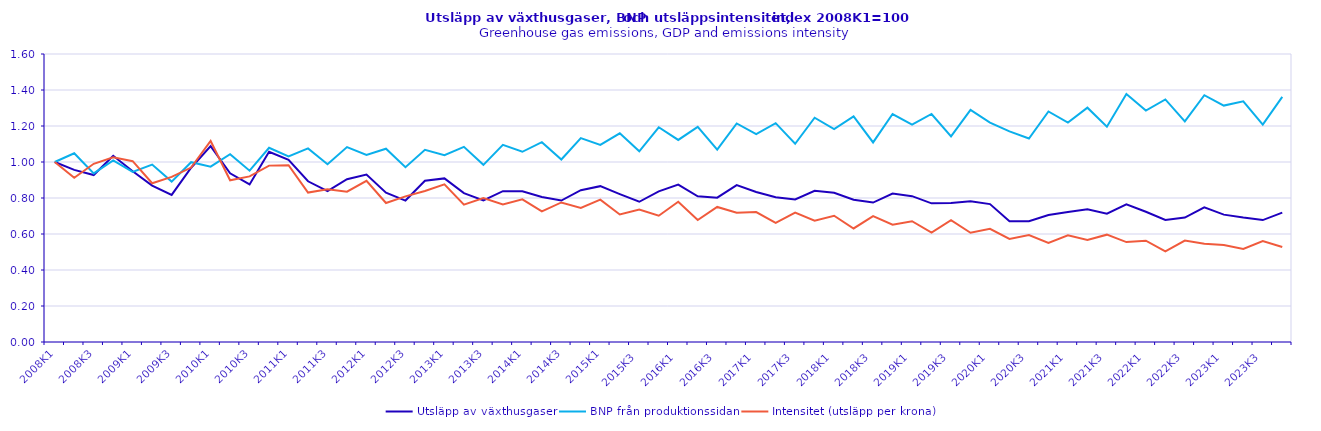
| Category | Utsläpp av växthusgaser | BNP från produktionssidan | Intensitet (utsläpp per krona) |
|---|---|---|---|
|  2008K1 | 1 | 1 | 1 |
|  2008K2 | 0.956 | 1.049 | 0.912 |
|  2008K3 | 0.927 | 0.937 | 0.99 |
|  2008K4 | 1.035 | 1.008 | 1.026 |
|  2009K1 | 0.949 | 0.945 | 1.004 |
|  2009K2 | 0.869 | 0.985 | 0.882 |
|  2009K3 | 0.817 | 0.891 | 0.917 |
|  2009K4 | 0.968 | 0.999 | 0.969 |
|  2010K1 | 1.088 | 0.974 | 1.117 |
|  2010K2 | 0.937 | 1.043 | 0.899 |
|  2010K3 | 0.875 | 0.952 | 0.92 |
|  2010K4 | 1.057 | 1.079 | 0.98 |
|  2011K1 | 1.013 | 1.031 | 0.982 |
|  2011K2 | 0.893 | 1.076 | 0.83 |
|  2011K3 | 0.838 | 0.988 | 0.849 |
|  2011K4 | 0.904 | 1.083 | 0.835 |
|  2012K1 | 0.931 | 1.039 | 0.896 |
|  2012K2 | 0.829 | 1.074 | 0.772 |
|  2012K3 | 0.786 | 0.971 | 0.809 |
|  2012K4 | 0.896 | 1.068 | 0.839 |
|  2013K1 | 0.909 | 1.038 | 0.876 |
|  2013K2 | 0.827 | 1.084 | 0.763 |
|  2013K3 | 0.787 | 0.984 | 0.799 |
|  2013K4 | 0.838 | 1.096 | 0.765 |
|  2014K1 | 0.838 | 1.057 | 0.793 |
|  2014K2 | 0.806 | 1.11 | 0.726 |
|  2014K3 | 0.786 | 1.014 | 0.775 |
|  2014K4 | 0.844 | 1.133 | 0.745 |
|  2015K1 | 0.866 | 1.095 | 0.791 |
|  2015K2 | 0.821 | 1.16 | 0.708 |
| 2015K3 | 0.779 | 1.06 | 0.735 |
| 2015K4 | 0.837 | 1.193 | 0.702 |
| 2016K1 | 0.874 | 1.123 | 0.779 |
| 2016K2 | 0.81 | 1.195 | 0.678 |
| 2016K3 | 0.802 | 1.069 | 0.75 |
| 2016K4 | 0.872 | 1.214 | 0.718 |
| 2017K1 | 0.834 | 1.155 | 0.722 |
| 2017K2 | 0.804 | 1.216 | 0.661 |
| 2017K3 | 0.792 | 1.101 | 0.719 |
| 2017K4 | 0.84 | 1.246 | 0.674 |
| 2018K1 | 0.829 | 1.182 | 0.701 |
| 2018K2 | 0.79 | 1.253 | 0.631 |
| 2018K3 | 0.775 | 1.109 | 0.699 |
| 2018K4 | 0.825 | 1.267 | 0.651 |
| 2019K1 | 0.81 | 1.207 | 0.671 |
| 2019K2 | 0.77 | 1.267 | 0.608 |
| 2019K3 | 0.773 | 1.142 | 0.676 |
| 2019K4 | 0.782 | 1.29 | 0.607 |
| 2020K1 | 0.766 | 1.219 | 0.629 |
| 2020K2 | 0.67 | 1.17 | 0.573 |
| 2020K3 | 0.671 | 1.13 | 0.594 |
| 2020K4 | 0.705 | 1.281 | 0.551 |
| 2021K1 | 0.723 | 1.219 | 0.593 |
| 2021K2 | 0.738 | 1.302 | 0.567 |
| 2021K3 | 0.713 | 1.196 | 0.596 |
| 2021K4 | 0.765 | 1.378 | 0.555 |
| 2022K1 | 0.723 | 1.286 | 0.563 |
| 2022K2 | 0.678 | 1.348 | 0.503 |
| 2022K3 | 0.691 | 1.226 | 0.564 |
| 2022K4 | 0.748 | 1.371 | 0.546 |
| 2023K1 | 0.708 | 1.313 | 0.539 |
| 2023K2 | 0.691 | 1.337 | 0.517 |
| 2023K3 | 0.677 | 1.208 | 0.561 |
| 2023K4 | 0.719 | 1.362 | 0.528 |